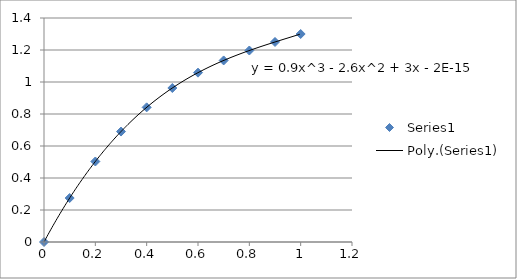
| Category | Series 0 |
|---|---|
| 0.0 | 0 |
| 0.1 | 0.275 |
| 0.2 | 0.503 |
| 0.3 | 0.69 |
| 0.4 | 0.842 |
| 0.5 | 0.962 |
| 0.6 | 1.058 |
| 0.7 | 1.135 |
| 0.8 | 1.197 |
| 0.9 | 1.25 |
| 1.0 | 1.3 |